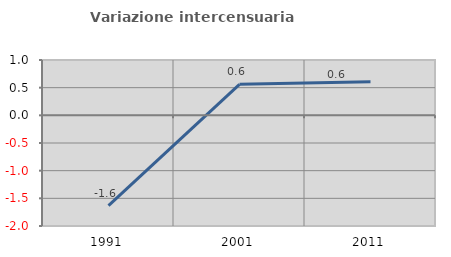
| Category | Variazione intercensuaria annua |
|---|---|
| 1991.0 | -1.631 |
| 2001.0 | 0.56 |
| 2011.0 | 0.607 |